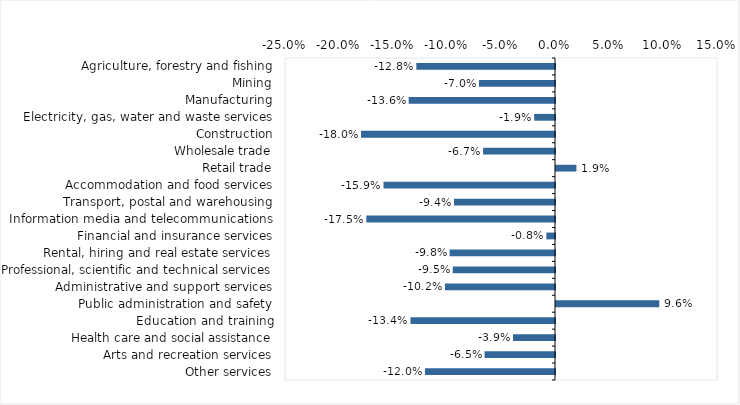
| Category | This week |
|---|---|
| Agriculture, forestry and fishing | -0.128 |
| Mining | -0.07 |
| Manufacturing | -0.136 |
| Electricity, gas, water and waste services | -0.019 |
| Construction | -0.18 |
| Wholesale trade | -0.067 |
| Retail trade | 0.019 |
| Accommodation and food services | -0.159 |
| Transport, postal and warehousing | -0.094 |
| Information media and telecommunications | -0.175 |
| Financial and insurance services | -0.008 |
| Rental, hiring and real estate services | -0.098 |
| Professional, scientific and technical services | -0.095 |
| Administrative and support services | -0.102 |
| Public administration and safety | 0.096 |
| Education and training | -0.134 |
| Health care and social assistance | -0.039 |
| Arts and recreation services | -0.065 |
| Other services | -0.12 |